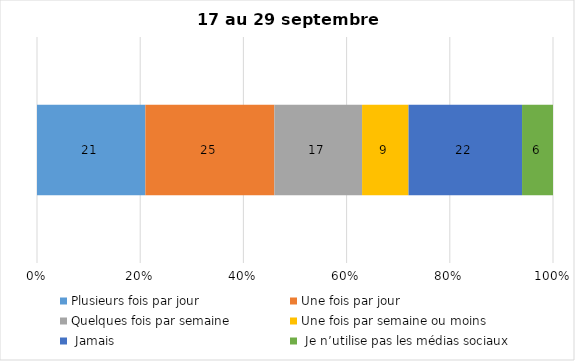
| Category | Plusieurs fois par jour | Une fois par jour | Quelques fois par semaine   | Une fois par semaine ou moins   |  Jamais   |  Je n’utilise pas les médias sociaux |
|---|---|---|---|---|---|---|
| 0 | 21 | 25 | 17 | 9 | 22 | 6 |